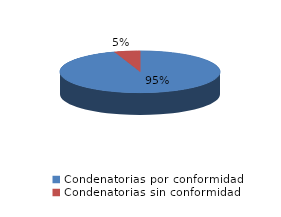
| Category | Series 0 |
|---|---|
| 0 | 404 |
| 1 | 22 |